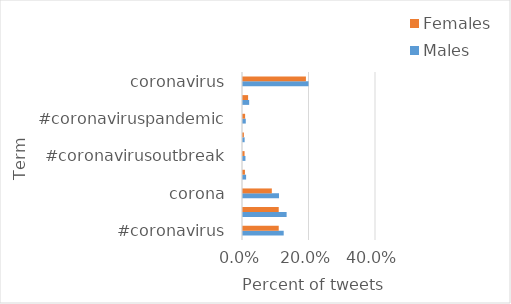
| Category | Males | Females |
|---|---|---|
| #coronavirus | 0.122 | 0.107 |
| virus | 0.131 | 0.107 |
| corona | 0.108 | 0.087 |
| #coronavirusupdate | 0.009 | 0.006 |
| #coronavirusoutbreak | 0.007 | 0.005 |
| #corona | 0.005 | 0.003 |
| #coronaviruspandemic | 0.008 | 0.006 |
| covid | 0.019 | 0.015 |
| coronavirus | 0.197 | 0.189 |